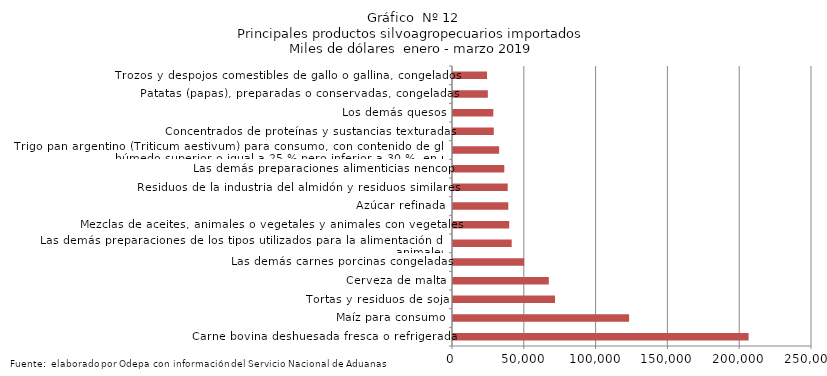
| Category | Series 0 |
|---|---|
| Carne bovina deshuesada fresca o refrigerada | 205839.245 |
| Maíz para consumo | 122650.145 |
| Tortas y residuos de soja | 71034.09 |
| Cerveza de malta | 66712.207 |
| Las demás carnes porcinas congeladas | 49581.206 |
| Las demás preparaciones de los tipos utilizados para la alimentación de los animales | 40870.617 |
| Mezclas de aceites, animales o vegetales y animales con vegetales | 39157.824 |
| Azúcar refinada | 38513.106 |
| Residuos de la industria del almidón y residuos similares | 38080.274 |
| Las demás preparaciones alimenticias nencop | 35733.209 |
| Trigo pan argentino (Triticum aestivum) para consumo, con contenido de gluten húmedo superior o igual a 25 % pero inferior a 30 %, en peso | 32116.962 |
| Concentrados de proteínas y sustancias texturadas | 28406.612 |
| Los demás quesos | 28054.882 |
| Patatas (papas), preparadas o conservadas, congeladas | 24264.89 |
| Trozos y despojos comestibles de gallo o gallina, congelados | 23708.379 |